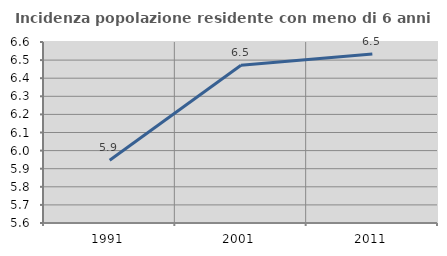
| Category | Incidenza popolazione residente con meno di 6 anni |
|---|---|
| 1991.0 | 5.947 |
| 2001.0 | 6.472 |
| 2011.0 | 6.534 |